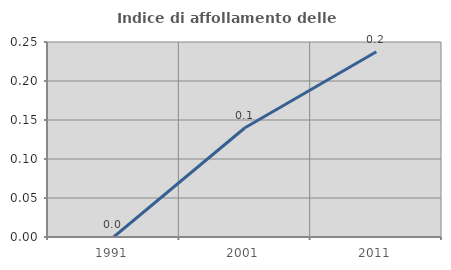
| Category | Indice di affollamento delle abitazioni  |
|---|---|
| 1991.0 | 0 |
| 2001.0 | 0.14 |
| 2011.0 | 0.238 |